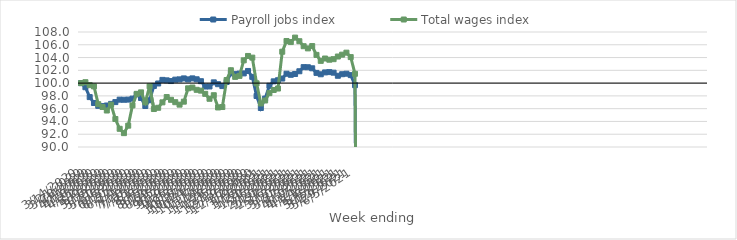
| Category | Payroll jobs index | Total wages index |
|---|---|---|
| 14/03/2020 | 100 | 100 |
| 21/03/2020 | 99.356 | 100.142 |
| 28/03/2020 | 97.809 | 99.68 |
| 04/04/2020 | 96.885 | 99.486 |
| 11/04/2020 | 96.44 | 96.702 |
| 18/04/2020 | 96.402 | 96.266 |
| 25/04/2020 | 96.497 | 95.71 |
| 02/05/2020 | 96.748 | 96.612 |
| 09/05/2020 | 97.029 | 94.381 |
| 16/05/2020 | 97.409 | 92.849 |
| 23/05/2020 | 97.393 | 92.172 |
| 30/05/2020 | 97.42 | 93.338 |
| 06/06/2020 | 97.572 | 96.512 |
| 13/06/2020 | 98.239 | 98.321 |
| 20/06/2020 | 97.675 | 98.552 |
| 27/06/2020 | 96.419 | 96.994 |
| 04/07/2020 | 97.315 | 99.5 |
| 11/07/2020 | 99.555 | 95.945 |
| 18/07/2020 | 99.941 | 96.141 |
| 25/07/2020 | 100.505 | 96.99 |
| 01/08/2020 | 100.433 | 97.817 |
| 08/08/2020 | 100.325 | 97.387 |
| 15/08/2020 | 100.542 | 97.013 |
| 22/08/2020 | 100.587 | 96.63 |
| 29/08/2020 | 100.737 | 97.097 |
| 05/09/2020 | 100.587 | 99.185 |
| 12/09/2020 | 100.74 | 99.303 |
| 19/09/2020 | 100.598 | 98.949 |
| 26/09/2020 | 100.3 | 98.822 |
| 03/10/2020 | 99.466 | 98.319 |
| 10/10/2020 | 99.474 | 97.549 |
| 17/10/2020 | 100.118 | 98.104 |
| 24/10/2020 | 99.832 | 96.189 |
| 31/10/2020 | 99.534 | 96.258 |
| 07/11/2020 | 100.172 | 100.483 |
| 14/11/2020 | 101.532 | 102.015 |
| 21/11/2020 | 101.406 | 100.976 |
| 28/11/2020 | 101.485 | 101.131 |
| 05/12/2020 | 101.52 | 103.565 |
| 12/12/2020 | 101.902 | 104.251 |
| 19/12/2020 | 100.978 | 103.989 |
| 26/12/2020 | 97.984 | 99.969 |
| 02/01/2021 | 96.104 | 96.817 |
| 09/01/2021 | 97.578 | 97.28 |
| 16/01/2021 | 99.58 | 98.429 |
| 23/01/2021 | 100.277 | 98.92 |
| 30/01/2021 | 100.449 | 99.151 |
| 06/02/2021 | 100.715 | 104.915 |
| 13/02/2021 | 101.468 | 106.593 |
| 20/02/2021 | 101.3 | 106.424 |
| 27/02/2021 | 101.428 | 107.127 |
| 06/03/2021 | 101.855 | 106.558 |
| 13/03/2021 | 102.501 | 105.776 |
| 20/03/2021 | 102.484 | 105.436 |
| 27/03/2021 | 102.321 | 105.799 |
| 03/04/2021 | 101.599 | 104.415 |
| 10/04/2021 | 101.382 | 103.482 |
| 17/04/2021 | 101.674 | 103.848 |
| 24/04/2021 | 101.722 | 103.664 |
| 01/05/2021 | 101.632 | 103.748 |
| 08/05/2021 | 101.15 | 104.161 |
| 15/05/2021 | 101.393 | 104.452 |
| 22/05/2021 | 101.472 | 104.766 |
| 29/05/2021 | 101.25 | 104.072 |
| 05/06/2021 | 99.681 | 101.461 |